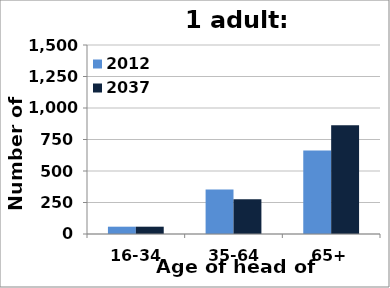
| Category | 2012 | 2037 |
|---|---|---|
| 16-34 | 58 | 58 |
| 35-64 | 354 | 276 |
| 65+ | 662 | 863 |